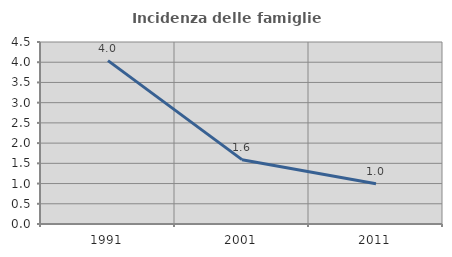
| Category | Incidenza delle famiglie numerose |
|---|---|
| 1991.0 | 4.039 |
| 2001.0 | 1.591 |
| 2011.0 | 0.996 |